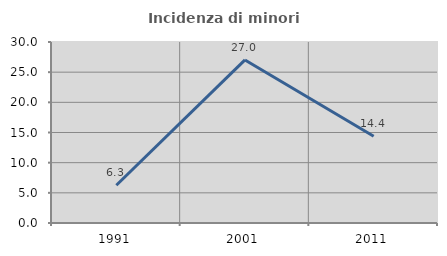
| Category | Incidenza di minori stranieri |
|---|---|
| 1991.0 | 6.25 |
| 2001.0 | 27.027 |
| 2011.0 | 14.391 |